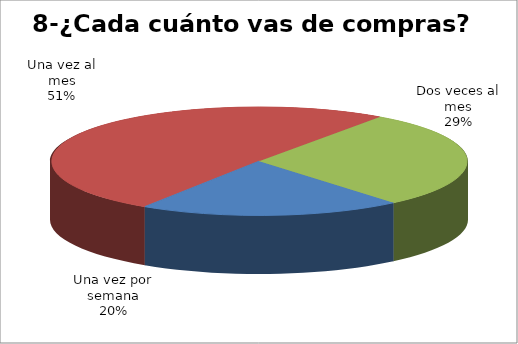
| Category | Series 0 |
|---|---|
| Una vez por semana | 67 |
| Una vez al mes | 167 |
| Dos veces al mes | 96 |